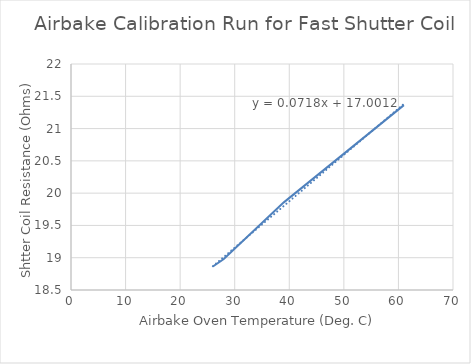
| Category | 61 |
|---|---|
| 26.0 | 18.864 |
| 28.0 | 18.98 |
| 39.0 | 19.857 |
| 61.0 | 21.363 |